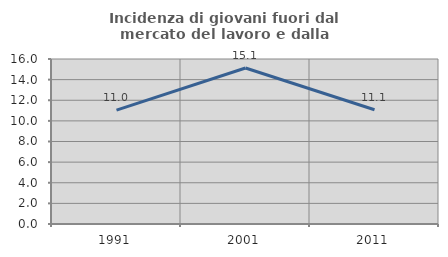
| Category | Incidenza di giovani fuori dal mercato del lavoro e dalla formazione  |
|---|---|
| 1991.0 | 11.047 |
| 2001.0 | 15.13 |
| 2011.0 | 11.082 |